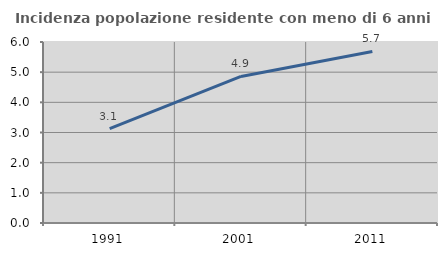
| Category | Incidenza popolazione residente con meno di 6 anni |
|---|---|
| 1991.0 | 3.125 |
| 2001.0 | 4.859 |
| 2011.0 | 5.688 |